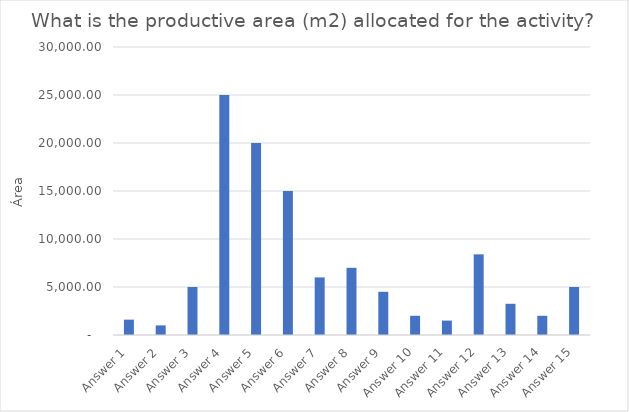
| Category |  What is the productive area (m2) allocated for the activity?  |
|---|---|
| Answer 1 | 1600 |
| Answer 2 | 1000 |
| Answer 3 | 5000 |
| Answer 4 | 25000 |
| Answer 5 | 20000 |
| Answer 6 | 15000 |
| Answer 7 | 6000 |
| Answer 8 | 7000 |
| Answer 9 | 4500 |
| Answer 10 | 2000 |
| Answer 11 | 1500 |
| Answer 12 | 8400 |
| Answer 13 | 3250 |
| Answer 14 | 2000 |
| Answer 15 | 5000 |